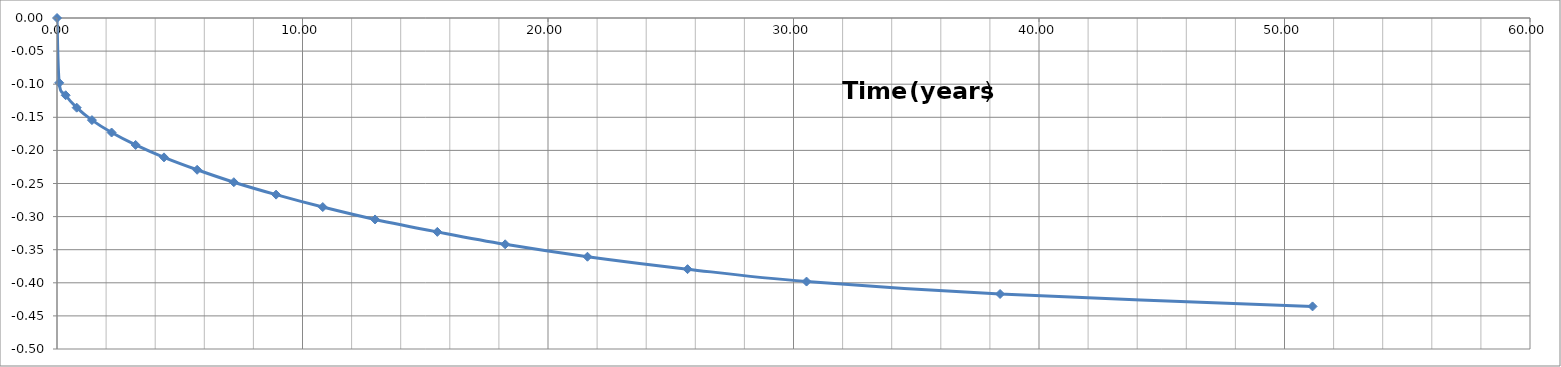
| Category | Series 0 |
|---|---|
| 0.0 | 0 |
| 0.09059940566789883 | -0.098 |
| 0.35333768210480543 | -0.117 |
| 0.8018047401609046 | -0.135 |
| 1.4224106689860112 | -0.154 |
| 2.2242154091469164 | -0.173 |
| 3.2026889903602234 | -0.192 |
| 4.357831412625933 | -0.211 |
| 5.707762557077626 | -0.229 |
| 7.202652750597956 | -0.248 |
| 8.924041458288032 | -0.267 |
| 10.826628977313907 | -0.286 |
| 12.955715010509532 | -0.304 |
| 15.4924983692107 | -0.323 |
| 18.255780242081613 | -0.342 |
| 21.60795825179387 | -0.361 |
| 25.684931506849313 | -0.379 |
| 30.531999710081905 | -0.398 |
| 38.414148003189105 | -0.417 |
| 51.14336449952889 | -0.436 |